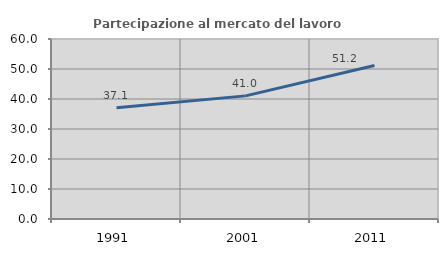
| Category | Partecipazione al mercato del lavoro  femminile |
|---|---|
| 1991.0 | 37.106 |
| 2001.0 | 41.043 |
| 2011.0 | 51.177 |